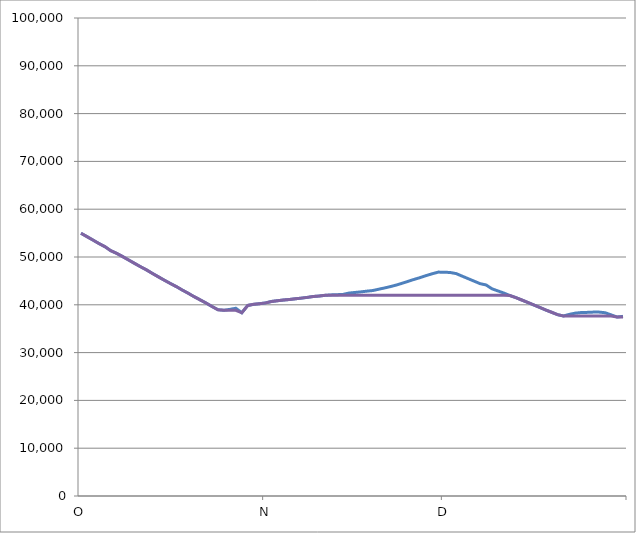
| Category | Volume, AF  | actual storage, AF |
|---|---|---|
| 2015-10-01 | 54966 | 54966 |
| 2015-10-02 | 54263 | 54263 |
| 2015-10-03 | 53551 | 53551 |
| 2015-10-04 | 52826 | 52826 |
| 2015-10-05 | 52178 | 52178 |
| 2015-10-06 | 51324 | 51324 |
| 2015-10-07 | 50744 | 50744 |
| 2015-10-08 | 50088 | 50088 |
| 2015-10-09 | 49368 | 49368 |
| 2015-10-10 | 48663 | 48663 |
| 2015-10-11 | 47963 | 47963 |
| 2015-10-12 | 47297 | 47297 |
| 2015-10-13 | 46565 | 46565 |
| 2015-10-14 | 45848 | 45848 |
| 2015-10-15 | 45145 | 45145 |
| 2015-10-16 | 44466 | 44466 |
| 2015-10-17 | 43813 | 43813 |
| 2015-10-18 | 43085 | 43085 |
| 2015-10-19 | 42422 | 42422 |
| 2015-10-20 | 41695 | 41695 |
| 2015-10-21 | 41041 | 41041 |
| 2015-10-22 | 40369 | 40369 |
| 2015-10-23 | 39633 | 39633 |
| 2015-10-24 | 38974 | 38974 |
| 2015-10-25 | 38856 | 38856 |
| 2015-10-26 | 39045 | 38856 |
| 2015-10-27 | 39277 | 38856 |
| 2015-10-28 | 38332 | 38332 |
| 2015-10-29 | 39866 | 39866 |
| 2015-10-30 | 40094 | 40094 |
| 2015-10-31 | 40239 | 40239 |
| 2015-11-01 | 40400 | 40400 |
| 2015-11-02 | 40707 | 40707 |
| 2015-11-03 | 40859 | 40859 |
| 2015-11-04 | 40999 | 40999 |
| 2015-11-05 | 41114 | 41114 |
| 2015-11-06 | 41255 | 41255 |
| 2015-11-07 | 41397 | 41397 |
| 2015-11-08 | 41554 | 41554 |
| 2015-11-09 | 41737 | 41737 |
| 2015-11-10 | 41842 | 41842 |
| 2015-11-11 | 41979 | 41979 |
| 2015-11-12 | 42074 | 41979 |
| 2015-11-13 | 42116 | 41979 |
| 2015-11-14 | 42174 | 41979 |
| 2015-11-15 | 42459 | 41979 |
| 2015-11-16 | 42580 | 41979 |
| 2015-11-17 | 42707 | 41979 |
| 2015-11-18 | 42855 | 41979 |
| 2015-11-19 | 42988 | 41979 |
| 2015-11-20 | 43265 | 41979 |
| 2015-11-21 | 43531 | 41979 |
| 2015-11-22 | 43824 | 41979 |
| 2015-11-23 | 44156 | 41979 |
| 2015-11-24 | 44536 | 41979 |
| 2015-11-25 | 44945 | 41979 |
| 2015-11-26 | 45344 | 41979 |
| 2015-11-27 | 45713 | 41979 |
| 2015-11-28 | 46130 | 41979 |
| 2015-11-29 | 46506 | 41979 |
| 2015-11-30 | 46839 | 41979 |
| 2015-12-01 | 46822 | 41979 |
| 2015-12-02 | 46756 | 41979 |
| 2015-12-03 | 46522 | 41979 |
| 2015-12-04 | 45989 | 41979 |
| 2015-12-05 | 45469 | 41979 |
| 2015-12-06 | 44950 | 41979 |
| 2015-12-07 | 44423 | 41979 |
| 2015-12-08 | 44156 | 41979 |
| 2015-12-09 | 43350 | 41979 |
| 2015-12-10 | 42898 | 41979 |
| 2015-12-11 | 42454 | 41979 |
| 2015-12-12 | 41942 | 41942 |
| 2015-12-13 | 41512 | 41512 |
| 2015-12-14 | 41004 | 41004 |
| 2015-12-15 | 40489 | 40489 |
| 2015-12-16 | 39970 | 39970 |
| 2015-12-17 | 39457 | 39457 |
| 2015-12-18 | 38923 | 38923 |
| 2015-12-19 | 38441 | 38441 |
| 2015-12-20 | 37941 | 37941 |
| 2015-12-21 | 37661 | 37661 |
| 2015-12-22 | 38002 | 37661 |
| 2015-12-23 | 38257 | 37661 |
| 2015-12-24 | 38385 | 37661 |
| 2015-12-25 | 38415 | 37661 |
| 2015-12-26 | 38472 | 37661 |
| 2015-12-27 | 38472 | 37661 |
| 2015-12-28 | 38338 | 37661 |
| 2015-12-29 | 37896 | 37661 |
| 2015-12-30 | 37438 | 37438 |
| 2015-12-31 | 37591 | 37438 |